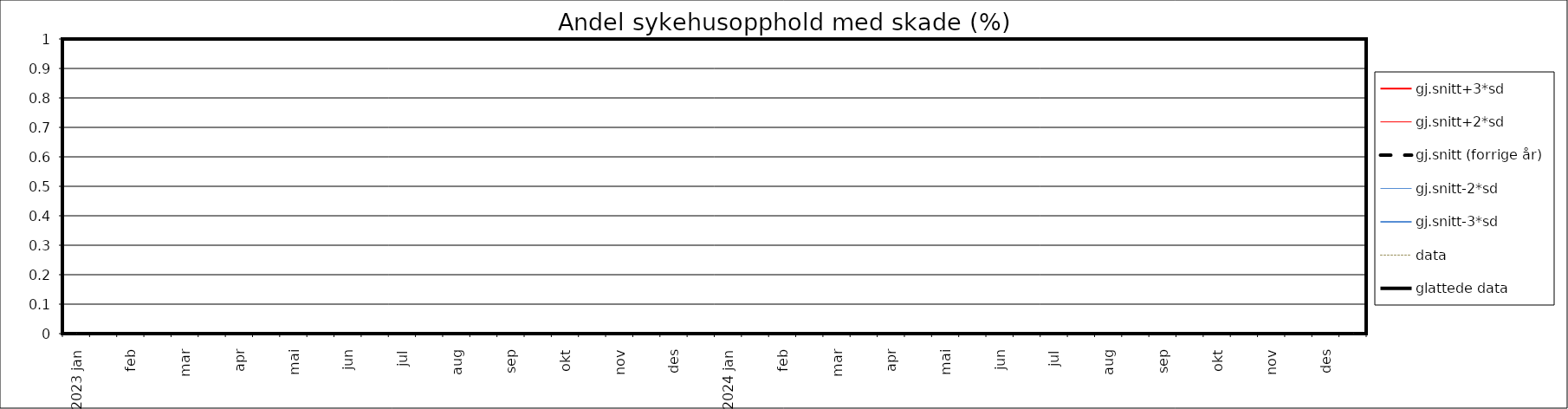
| Category | gj.snitt+3*sd | gj.snitt+2*sd | gj.snitt (forrige år) | gj.snitt-2*sd | gj.snitt-3*sd | data | glattede data |
|---|---|---|---|---|---|---|---|
| 2023 jan | 0 | 0 | 0 | 0 | 0 | 0 | 0 |
|  | 0 | 0 | 0 | 0 | 0 | 0 | 0 |
| feb | 0 | 0 | 0 | 0 | 0 | 0 | 0 |
|  | 0 | 0 | 0 | 0 | 0 | 0 | 0 |
| mar | 0 | 0 | 0 | 0 | 0 | 0 | 0 |
|  | 0 | 0 | 0 | 0 | 0 | 0 | 0 |
| apr | 0 | 0 | 0 | 0 | 0 | 0 | 0 |
|  | 0 | 0 | 0 | 0 | 0 | 0 | 0 |
| mai | 0 | 0 | 0 | 0 | 0 | 0 | 0 |
|  | 0 | 0 | 0 | 0 | 0 | 0 | 0 |
| jun | 0 | 0 | 0 | 0 | 0 | 0 | 0 |
|  | 0 | 0 | 0 | 0 | 0 | 0 | 0 |
| jul | 0 | 0 | 0 | 0 | 0 | 0 | 0 |
|  | 0 | 0 | 0 | 0 | 0 | 0 | 0 |
| aug | 0 | 0 | 0 | 0 | 0 | 0 | 0 |
|  | 0 | 0 | 0 | 0 | 0 | 0 | 0 |
| sep | 0 | 0 | 0 | 0 | 0 | 0 | 0 |
|  | 0 | 0 | 0 | 0 | 0 | 0 | 0 |
| okt | 0 | 0 | 0 | 0 | 0 | 0 | 0 |
|  | 0 | 0 | 0 | 0 | 0 | 0 | 0 |
| nov | 0 | 0 | 0 | 0 | 0 | 0 | 0 |
|  | 0 | 0 | 0 | 0 | 0 | 0 | 0 |
| des | 0 | 0 | 0 | 0 | 0 | 0 | 0 |
|  | 0 | 0 | 0 | 0 | 0 | 0 | 0 |
| 2024 jan | 0 | 0 | 0 | 0 | 0 | 0 | 0 |
|  | 0 | 0 | 0 | 0 | 0 | 0 | 0 |
| feb | 0 | 0 | 0 | 0 | 0 | 0 | 0 |
|  | 0 | 0 | 0 | 0 | 0 | 0 | 0 |
| mar | 0 | 0 | 0 | 0 | 0 | 0 | 0 |
|  | 0 | 0 | 0 | 0 | 0 | 0 | 0 |
| apr | 0 | 0 | 0 | 0 | 0 | 0 | 0 |
|  | 0 | 0 | 0 | 0 | 0 | 0 | 0 |
| mai | 0 | 0 | 0 | 0 | 0 | 0 | 0 |
|  | 0 | 0 | 0 | 0 | 0 | 0 | 0 |
| jun | 0 | 0 | 0 | 0 | 0 | 0 | 0 |
|  | 0 | 0 | 0 | 0 | 0 | 0 | 0 |
| jul | 0 | 0 | 0 | 0 | 0 | 0 | 0 |
|  | 0 | 0 | 0 | 0 | 0 | 0 | 0 |
| aug | 0 | 0 | 0 | 0 | 0 | 0 | 0 |
|  | 0 | 0 | 0 | 0 | 0 | 0 | 0 |
| sep | 0 | 0 | 0 | 0 | 0 | 0 | 0 |
|  | 0 | 0 | 0 | 0 | 0 | 0 | 0 |
| okt | 0 | 0 | 0 | 0 | 0 | 0 | 0 |
|  | 0 | 0 | 0 | 0 | 0 | 0 | 0 |
| nov | 0 | 0 | 0 | 0 | 0 | 0 | 0 |
|  | 0 | 0 | 0 | 0 | 0 | 0 | 0 |
| des | 0 | 0 | 0 | 0 | 0 | 0 | 0 |